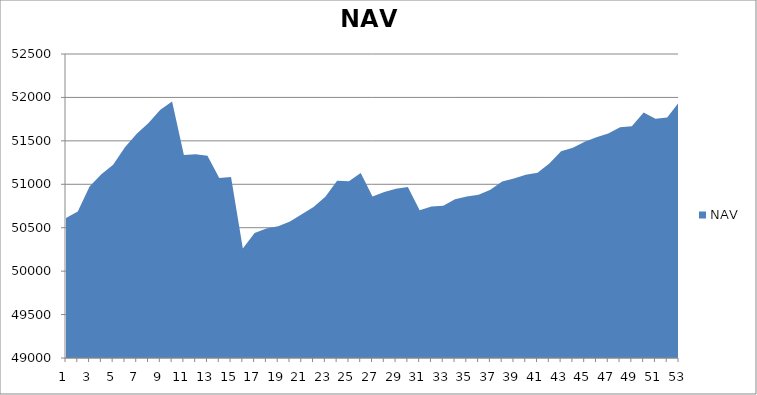
| Category | NAV |
|---|---|
| 0 | 50612.255 |
| 1 | 50687.913 |
| 2 | 50975.413 |
| 3 | 51115.874 |
| 4 | 51223.542 |
| 5 | 51427.364 |
| 6 | 51580.567 |
| 7 | 51704.692 |
| 8 | 51858.016 |
| 9 | 51951.766 |
| 10 | 51336.067 |
| 11 | 51345.356 |
| 12 | 51328.667 |
| 13 | 51072.985 |
| 14 | 51085.199 |
| 15 | 50261.67 |
| 16 | 50438.394 |
| 17 | 50489.896 |
| 18 | 50518.251 |
| 19 | 50572.468 |
| 20 | 50655.55 |
| 21 | 50737.787 |
| 22 | 50856.035 |
| 23 | 51041.806 |
| 24 | 51034.925 |
| 25 | 51128.589 |
| 26 | 50859.456 |
| 27 | 50911.137 |
| 28 | 50950.007 |
| 29 | 50970.175 |
| 30 | 50701.326 |
| 31 | 50743.495 |
| 32 | 50751.546 |
| 33 | 50826.725 |
| 34 | 50860.533 |
| 35 | 50879.283 |
| 36 | 50936.644 |
| 37 | 51031.381 |
| 38 | 51065.306 |
| 39 | 51109.987 |
| 40 | 51132.251 |
| 41 | 51238.242 |
| 42 | 51380.786 |
| 43 | 51420.042 |
| 44 | 51490.787 |
| 45 | 51541.14 |
| 46 | 51584.924 |
| 47 | 51657.998 |
| 48 | 51667.348 |
| 49 | 51825.763 |
| 50 | 51755.412 |
| 51 | 51767.57 |
| 52 | 51945.15 |